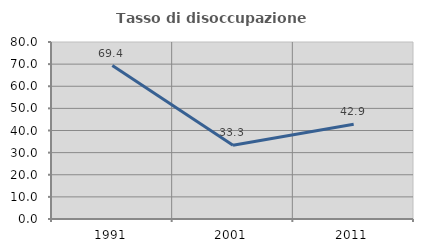
| Category | Tasso di disoccupazione giovanile  |
|---|---|
| 1991.0 | 69.355 |
| 2001.0 | 33.333 |
| 2011.0 | 42.857 |